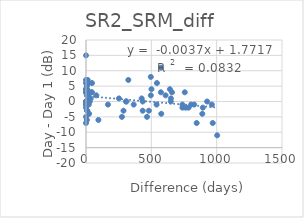
| Category | SR2_SRM_diff |
|---|---|
| 13.0 | 7 |
| 574.0 | 11 |
| 738.0 | -2 |
| 310.0 | 0 |
| 0.0 | 15 |
| 6.0 | 2 |
| 8.0 | -3 |
| 763.0 | -2 |
| 1004.0 | -11 |
| 0.0 | 6 |
| 18.0 | 6 |
| 79.0 | 2 |
| 0.0 | 3 |
| 609.0 | 2 |
| 0.0 | -1 |
| 36.0 | 1 |
| 576.0 | -4 |
| 543.0 | 6 |
| 0.0 | 3 |
| 9.0 | 4 |
| 6.0 | 3 |
| 46.0 | 6 |
| 29.0 | 0 |
| 0.0 | -2 |
| 3.0 | 0 |
| 642.0 | 4 |
| 0.0 | -7 |
| 0.0 | 0 |
| 0.0 | 7 |
| 0.0 | -5 |
| 481.0 | -3 |
| 95.0 | -6 |
| 0.0 | 4 |
| 6.0 | 3 |
| 1.0 | 0 |
| 168.0 | -1 |
| 927.0 | 0 |
| 467.0 | -5 |
| 46.0 | 3 |
| 21.0 | 3 |
| 324.0 | 7 |
| 970.0 | -7 |
| 38.0 | 3 |
| 963.0 | -1 |
| 573.0 | 3 |
| 0.0 | 0 |
| 21.0 | -1 |
| 275.0 | -5 |
| 847.0 | -7 |
| 10.0 | -3 |
| 434.0 | 0 |
| 649.0 | 0 |
| 496.0 | 8 |
| 894.0 | -2 |
| 434.0 | -3 |
| 20.0 | 6 |
| 426.0 | 1 |
| 305.0 | 0 |
| 890.0 | -4 |
| 6.0 | 5 |
| 14.0 | 1 |
| 287.0 | -3 |
| 365.0 | -1 |
| 738.0 | -1 |
| 650.0 | 1 |
| 540.0 | -1 |
| 756.0 | 3 |
| 7.0 | -6 |
| 0.0 | 0 |
| 252.0 | 1 |
| 501.0 | 4 |
| 16.0 | 2 |
| 496.0 | 2 |
| 658.0 | 3 |
| 785.0 | -2 |
| 804.0 | -1 |
| 0.0 | 4 |
| 0.0 | -1 |
| 828.0 | -1 |
| 0.0 | -1 |
| 24.0 | -4 |
| 10.0 | 6 |